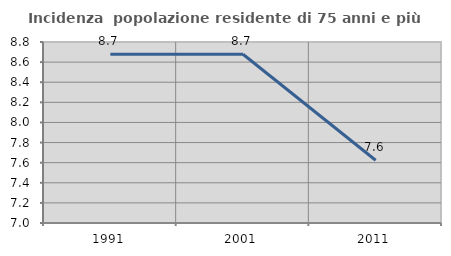
| Category | Incidenza  popolazione residente di 75 anni e più |
|---|---|
| 1991.0 | 8.678 |
| 2001.0 | 8.678 |
| 2011.0 | 7.624 |